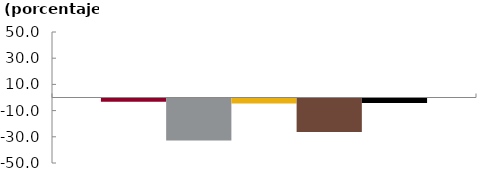
| Category | Bancos | CF | CFC | Coop | Sistema |
|---|---|---|---|---|---|
|  | -2.554 | -32.04 | -3.755 | -25.539 | -3.41 |